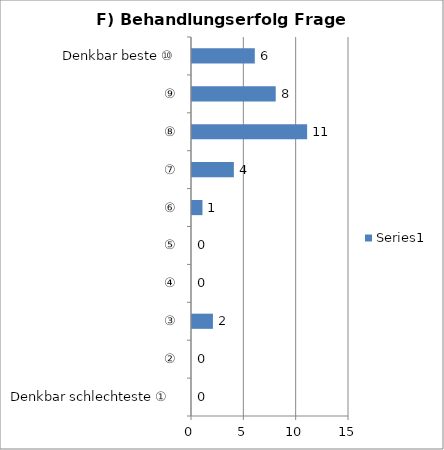
| Category | Series 0 |
|---|---|
| Denkbar schlechteste ①  | 0 |
| ② | 0 |
| ③ | 2 |
| ④ | 0 |
| ⑤ | 0 |
| ⑥ | 1 |
| ⑦ | 4 |
| ⑧ | 11 |
| ⑨ | 8 |
| Denkbar beste ⑩ | 6 |